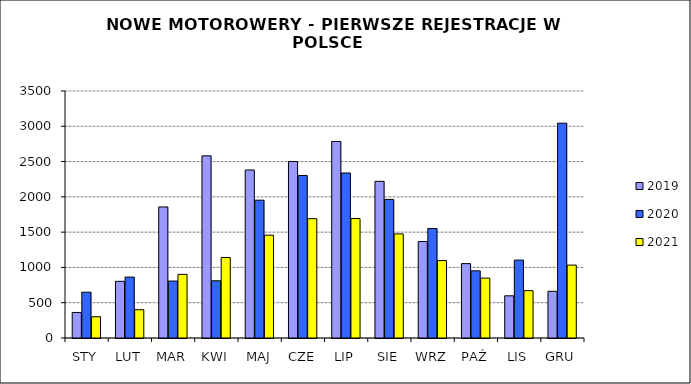
| Category | 2019 | 2020 | 2021 |
|---|---|---|---|
|  STY  | 362 | 649 | 301 |
|  LUT  | 803 | 863 | 401 |
| MAR | 1857 | 807 | 902 |
| KWI | 2581 | 811 | 1140 |
| MAJ | 2381 | 1953 | 1457 |
| CZE | 2501 | 2303 | 1691 |
| LIP | 2785 | 2338 | 1693 |
| SIE | 2220 | 1964 | 1475 |
| WRZ | 1367 | 1552 | 1097 |
| PAŹ | 1054 | 952 | 849 |
| LIS | 598 | 1104 | 671 |
| GRU | 662 | 3044 | 1033 |